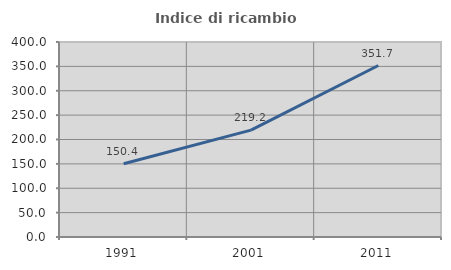
| Category | Indice di ricambio occupazionale  |
|---|---|
| 1991.0 | 150.368 |
| 2001.0 | 219.171 |
| 2011.0 | 351.724 |